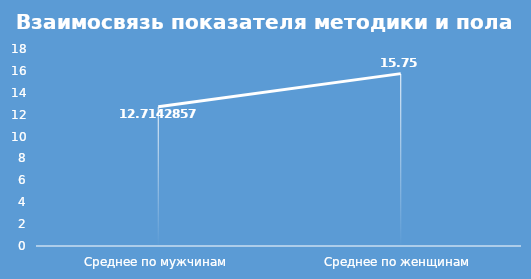
| Category | Series 0 |
|---|---|
| Среднее по мужчинам | 12.714 |
| Среднее по женщинам | 15.75 |